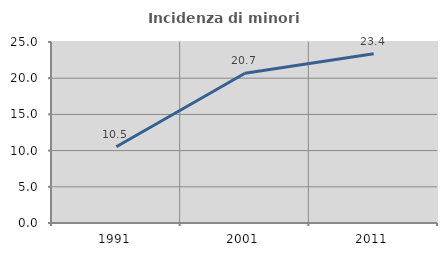
| Category | Incidenza di minori stranieri |
|---|---|
| 1991.0 | 10.526 |
| 2001.0 | 20.677 |
| 2011.0 | 23.38 |